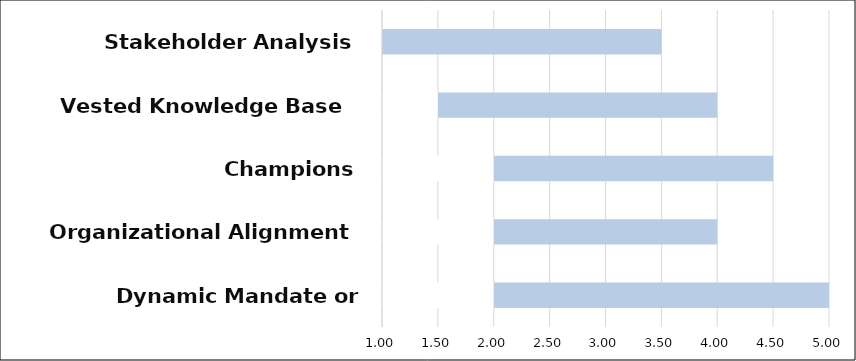
| Category | Minimum | Maximum |
|---|---|---|
| Dynamic Mandate or Guardrails  | 2 | 3 |
| Organizational Alignment | 2 | 2 |
| Champions | 2 | 2.5 |
| Vested Knowledge Base  | 1.5 | 2.5 |
| Stakeholder Analysis | 1 | 2.5 |